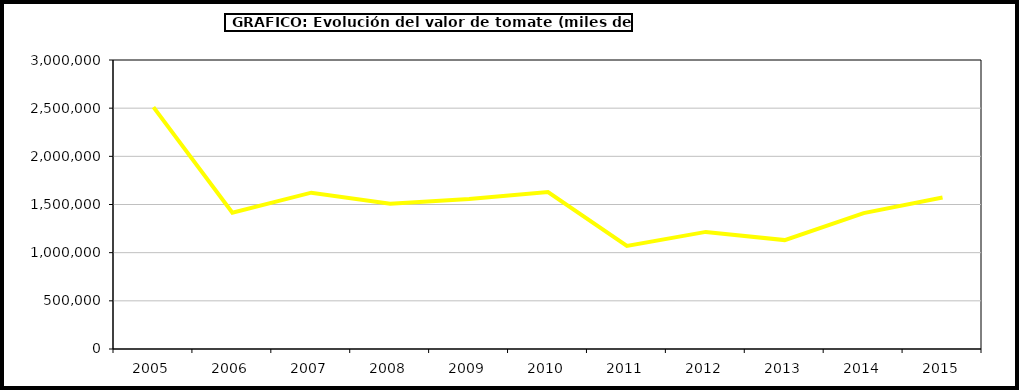
| Category | Valor |
|---|---|
| 2005.0 | 2510496.092 |
| 2006.0 | 1415325.565 |
| 2007.0 | 1622795.255 |
| 2008.0 | 1508532.993 |
| 2009.0 | 1556488.393 |
| 2010.0 | 1629341.46 |
| 2011.0 | 1069974.828 |
| 2012.0 | 1215542.465 |
| 2013.0 | 1130344.662 |
| 2014.0 | 1410496.854 |
| 2015.0 | 1573527 |